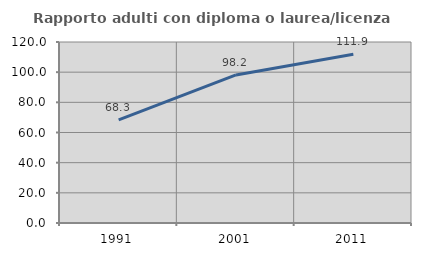
| Category | Rapporto adulti con diploma o laurea/licenza media  |
|---|---|
| 1991.0 | 68.341 |
| 2001.0 | 98.185 |
| 2011.0 | 111.867 |